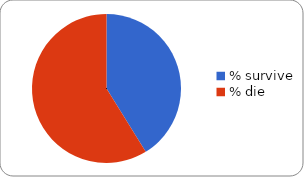
| Category | Series 0 |
|---|---|
| % survive | 0.412 |
| % die | 0.588 |